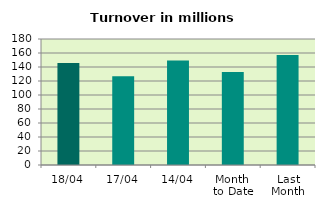
| Category | Series 0 |
|---|---|
| 18/04 | 145.862 |
| 17/04 | 126.739 |
| 14/04 | 149.347 |
| Month 
to Date | 132.914 |
| Last
Month | 157.238 |